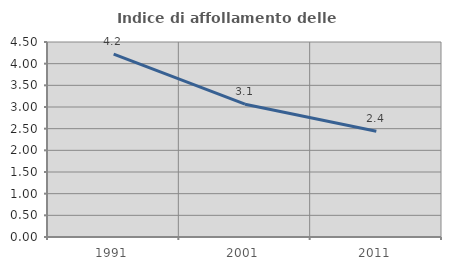
| Category | Indice di affollamento delle abitazioni  |
|---|---|
| 1991.0 | 4.221 |
| 2001.0 | 3.065 |
| 2011.0 | 2.439 |